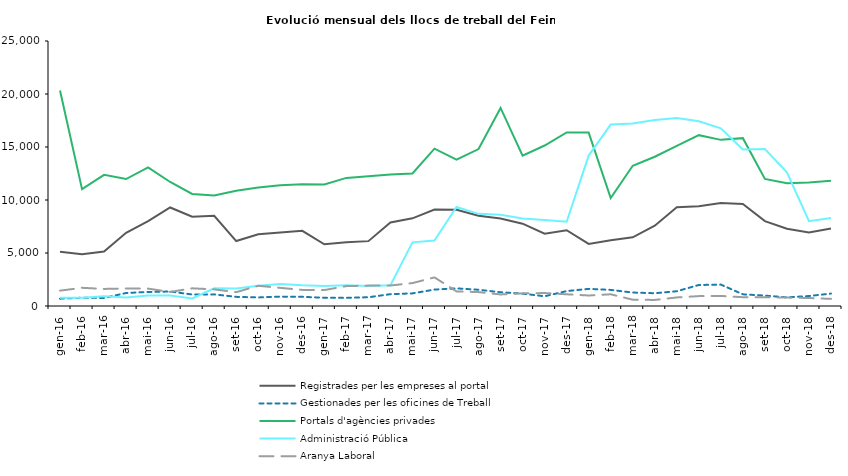
| Category | Registrades per les empreses al portal | Gestionades per les oficines de Treball | Portals d'agències privades | Administració Pública | Aranya Laboral |
|---|---|---|---|---|---|
| gen-16 | 5107 | 691 | 20322 | 774 | 1447 |
| feb-16 | 4887 | 779 | 11028 | 777 | 1716 |
| mar-16 | 5133 | 759 | 12378 | 911 | 1611 |
| abr-16 | 6906 | 1226 | 11980 | 807 | 1653 |
| mai-16 | 7999 | 1325 | 13085 | 983 | 1639 |
| jun-16 | 9293 | 1366 | 11700 | 984 | 1327 |
| jul-16 | 8417 | 1084 | 10572 | 713 | 1667 |
| ago-16 | 8503 | 1097 | 10425 | 1663 | 1568 |
| set-16 | 6126 | 862 | 10864 | 1660 | 1305 |
| oct-16 | 6759 | 808 | 11178 | 1919 | 1909 |
| nov-16 | 6939 | 887 | 11381 | 2080 | 1711 |
| des-16 | 7090 | 866 | 11486 | 1953 | 1517 |
| gen-17 | 5827 | 778 | 11465 | 1885 | 1506 |
| feb-17 | 6008 | 769 | 12085 | 1956 | 1875 |
| mar-17 | 6119 | 825 | 12230 | 1895 | 1925 |
| abr-17 | 7879 | 1117 | 12397 | 1963 | 1934 |
| mai-17 | 8271 | 1191 | 12507 | 6004 | 2162 |
| jun-17 | 9107 | 1550 | 14842 | 6170 | 2698 |
| jul-17 | 9078 | 1662 | 13811 | 9338 | 1379 |
| ago-17 | 8522 | 1532 | 14803 | 8694 | 1312 |
| set-17 | 8251 | 1298 | 18684 | 8602 | 1090 |
| oct-17 | 7766 | 1167 | 14184 | 8247 | 1193 |
| nov-17 | 6825 | 918 | 15141 | 8119 | 1221 |
| des-17 | 7150 | 1408 | 16374 | 7952 | 1105 |
| gen-18 | 5856 | 1616 | 16359 | 14191 | 991 |
| feb-18 | 6202 | 1519 | 10189 | 17116 | 1105 |
| mar-18 | 6484 | 1270 | 13227 | 17208 | 595 |
| abr-18 | 7572 | 1205 | 14080 | 17548 | 573 |
| mai-18 | 9317 | 1393 | 15100 | 17729 | 807 |
| jun-18 | 9400 | 1981 | 16117 | 17430 | 933 |
| jul-18 | 9711 | 2020 | 15674 | 16756 | 949 |
| ago-18 | 9630 | 1101 | 15834 | 14774 | 831 |
| set-18 | 8012 | 982 | 11991 | 14817 | 823 |
| oct-18 | 7288 | 815 | 11590 | 12616 | 794 |
| nov-18 | 6938 | 941 | 11661 | 8005 | 753 |
| des-18 | 7305 | 1173 | 11820 | 8306 | 672 |